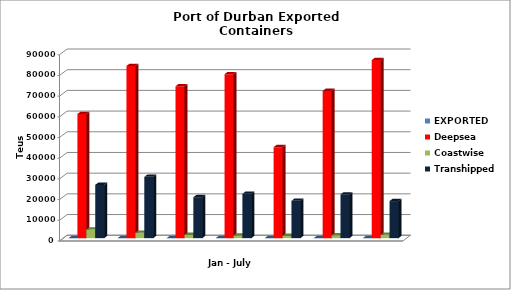
| Category | EXPORTED | Deepsea | Coastwise | Transhipped |
|---|---|---|---|---|
|  | 0 | 59987 | 4178 | 25746 |
|  | 0 | 83211 | 2636 | 29625 |
|  | 0 | 73417 | 1573 | 19801 |
|  | 0 | 79243 | 1276 | 21418 |
|  | 0 | 43992 | 1096 | 18056 |
|  | 0 | 71163 | 1393 | 21125 |
|  | 0 | 86039 | 1596 | 17925 |